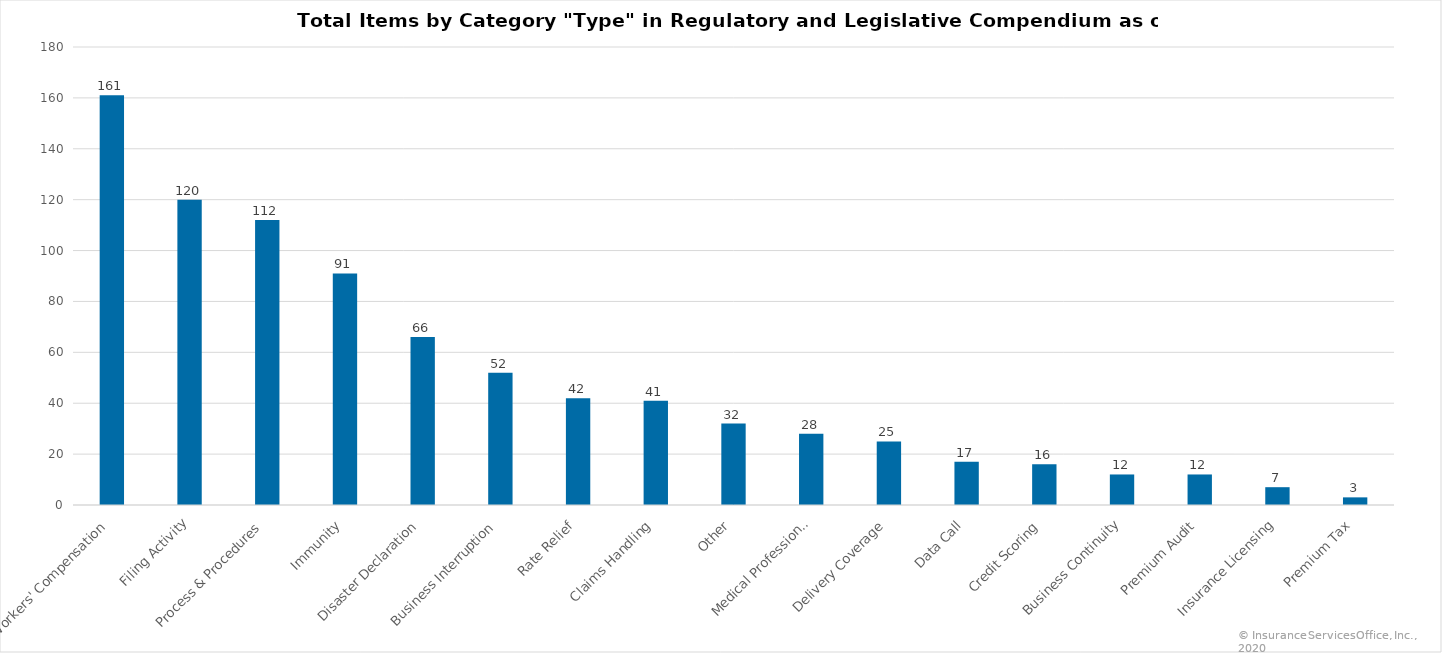
| Category | Count |
|---|---|
| Workers' Compensation | 161 |
| Filing Activity | 120 |
| Process & Procedures | 112 |
| Immunity | 91 |
| Disaster Declaration | 66 |
| Business Interruption | 52 |
| Rate Relief | 42 |
| Claims Handling | 41 |
| Other | 32 |
| Medical Professional | 28 |
| Delivery Coverage | 25 |
| Data Call | 17 |
| Credit Scoring | 16 |
| Business Continuity | 12 |
| Premium Audit | 12 |
| Insurance Licensing | 7 |
| Premium Tax | 3 |